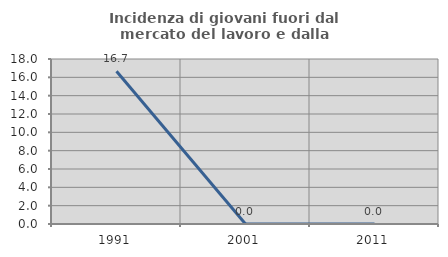
| Category | Incidenza di giovani fuori dal mercato del lavoro e dalla formazione  |
|---|---|
| 1991.0 | 16.667 |
| 2001.0 | 0 |
| 2011.0 | 0 |